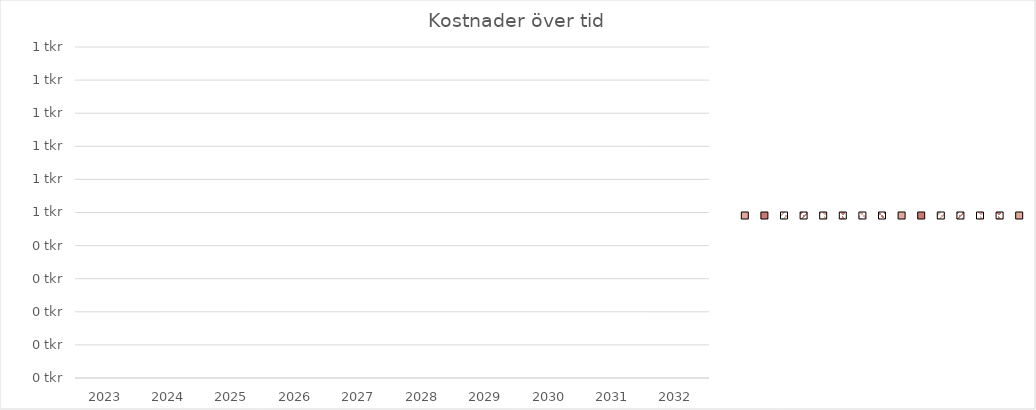
| Category | Series 14 | Series 13 | Series 12 | Series 11 | Series 10 | Series 9 | Series 8 | Series 7 | Series 6 | Series 5 | Series 4 | Series 3 | Series 2 | Series 1 | Series 0 |
|---|---|---|---|---|---|---|---|---|---|---|---|---|---|---|---|
| 2023.0 | 0 | 0 | 0 | 0 | 0 | 0 | 0 | 0 | 0 | 0 | 0 | 0 | 0 | 0 | 0 |
| 2024.0 | 0 | 0 | 0 | 0 | 0 | 0 | 0 | 0 | 0 | 0 | 0 | 0 | 0 | 0 | 0 |
| 2025.0 | 0 | 0 | 0 | 0 | 0 | 0 | 0 | 0 | 0 | 0 | 0 | 0 | 0 | 0 | 0 |
| 2026.0 | 0 | 0 | 0 | 0 | 0 | 0 | 0 | 0 | 0 | 0 | 0 | 0 | 0 | 0 | 0 |
| 2027.0 | 0 | 0 | 0 | 0 | 0 | 0 | 0 | 0 | 0 | 0 | 0 | 0 | 0 | 0 | 0 |
| 2028.0 | 0 | 0 | 0 | 0 | 0 | 0 | 0 | 0 | 0 | 0 | 0 | 0 | 0 | 0 | 0 |
| 2029.0 | 0 | 0 | 0 | 0 | 0 | 0 | 0 | 0 | 0 | 0 | 0 | 0 | 0 | 0 | 0 |
| 2030.0 | 0 | 0 | 0 | 0 | 0 | 0 | 0 | 0 | 0 | 0 | 0 | 0 | 0 | 0 | 0 |
| 2031.0 | 0 | 0 | 0 | 0 | 0 | 0 | 0 | 0 | 0 | 0 | 0 | 0 | 0 | 0 | 0 |
| 2032.0 | 0 | 0 | 0 | 0 | 0 | 0 | 0 | 0 | 0 | 0 | 0 | 0 | 0 | 0 | 0 |